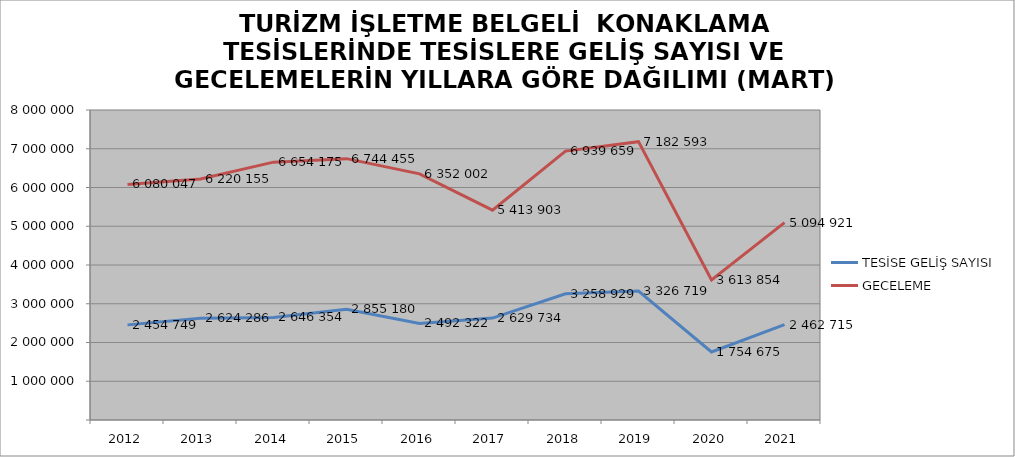
| Category | TESİSE GELİŞ SAYISI | GECELEME |
|---|---|---|
| 2012 | 2454749 | 6080047 |
| 2013 | 2624286 | 6220155 |
| 2014 | 2646354 | 6654175 |
| 2015 | 2855180 | 6744455 |
| 2016 | 2492322 | 6352002 |
| 2017 | 2629734 | 5413903 |
| 2018 | 3258929 | 6939659 |
| 2019 | 3326719 | 7182593 |
| 2020 | 1754675 | 3613854 |
| 2021 | 2462715 | 5094921 |